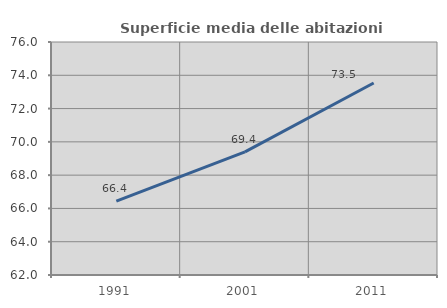
| Category | Superficie media delle abitazioni occupate |
|---|---|
| 1991.0 | 66.442 |
| 2001.0 | 69.394 |
| 2011.0 | 73.536 |